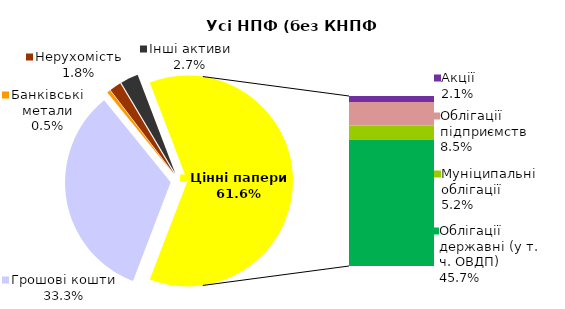
| Category | Усі НПФ (без КНПФ НБУ) |
|---|---|
| Грошові кошти | 669.349 |
| Банківські метали | 10.485 |
| Нерухомість | 35.602 |
| Інші активи | 55.073 |
| Акції | 42.759 |
| Облігації підприємств | 171.431 |
| Муніципальні облігації | 104.799 |
| Облігації державні (у т. ч. ОВДП) | 917.791 |